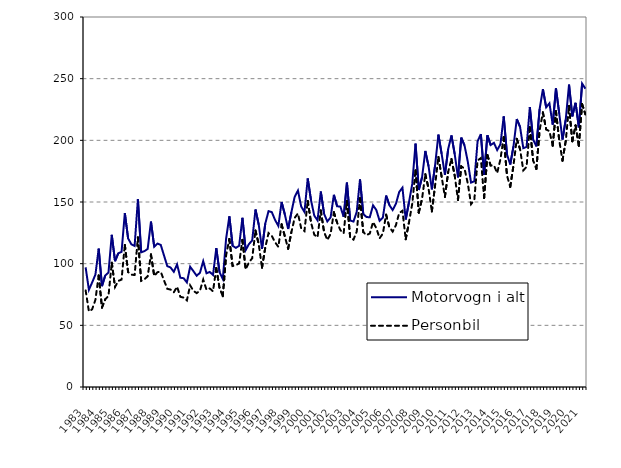
| Category | Motorvogn i alt | Personbil |
|---|---|---|
| 1983.0 | 97 | 78.3 |
| nan | 78.8 | 61.3 |
| nan | 84.8 | 63 |
| nan | 91.2 | 70.8 |
| 1984.0 | 112.2 | 90.4 |
| nan | 81.8 | 64.4 |
| nan | 90.4 | 71.1 |
| nan | 92.9 | 73.9 |
| 1985.0 | 123.4 | 100.8 |
| nan | 102 | 81.1 |
| nan | 108.4 | 86 |
| nan | 109.6 | 87.1 |
| 1986.0 | 141 | 115.2 |
| nan | 120.5 | 93.2 |
| nan | 115.7 | 91.1 |
| nan | 114.4 | 90.8 |
| 1987.0 | 152.2 | 121.3 |
| nan | 109.2 | 86.1 |
| nan | 110.1 | 87.3 |
| nan | 112 | 89.8 |
| 1988.0 | 134.1 | 107.5 |
| nan | 113.7 | 90 |
| nan | 116.3 | 93.1 |
| nan | 115.2 | 93.4 |
| 1989.0 | 106.6 | 86.4 |
| nan | 98 | 79.6 |
| nan | 96.9 | 79 |
| nan | 93.4 | 76.8 |
| 1990.0 | 99.4 | 81.3 |
| nan | 88.6 | 73.1 |
| nan | 88.2 | 72.5 |
| nan | 84.8 | 70.2 |
| 1991.0 | 97.5 | 82.4 |
| nan | 93.9 | 78 |
| nan | 90.2 | 76.1 |
| nan | 92.6 | 78.1 |
| 1992.0 | 102 | 87.1 |
| nan | 92.2 | 78.9 |
| nan | 93.3 | 79.9 |
| nan | 90.8 | 77.6 |
| 1993.0 | 112.6 | 96.5 |
| nan | 93 | 80.1 |
| nan | 87.5 | 73.6 |
| nan | 120.1 | 106.6 |
| 1994.0 | 138.4 | 120 |
| nan | 114.5 | 98.1 |
| nan | 112.8 | 98.8 |
| nan | 114.5 | 100.2 |
| 1995.0 | 137.2 | 119.3 |
| nan | 111 | 95.4 |
| nan | 115.9 | 101 |
| nan | 118.8 | 104.4 |
| 1996.0 | 143.9 | 126.9 |
| nan | 131.6 | 115.7 |
| nan | 112 | 96.7 |
| nan | 132.5 | 113.1 |
| 1997.0 | 142.6 | 124.8 |
| nan | 141.8 | 122.5 |
| nan | 135.4 | 117.3 |
| nan | 130.6 | 113.7 |
| 1998.0 | 150 | 131.9 |
| nan | 139.8 | 122 |
| nan | 128.1 | 112.1 |
| nan | 141.8 | 125.6 |
| 1999.0 | 154.2 | 137.1 |
| nan | 159.3 | 140.7 |
| nan | 146.3 | 128.7 |
| nan | 141.9 | 126.4 |
| 2000.0 | 169.1 | 150.9 |
| nan | 151.5 | 133.4 |
| nan | 139 | 123.5 |
| nan | 135.1 | 121.4 |
| 2001.0 | 158.5 | 143.1 |
| nan | 140.46 | 125.7 |
| nan | 134.24 | 119.2 |
| nan | 137.495 | 124.072 |
| 2002.0 | 155.814 | 141.724 |
| nan | 146.543 | 133.19 |
| nan | 146.231 | 127.141 |
| nan | 137.967 | 124.641 |
| 2003.0 | 165.679 | 150.811 |
| nan | 135.021 | 121.101 |
| nan | 134.111 | 119.491 |
| nan | 142.013 | 125.959 |
| 2004.0 | 168.309 | 153.043 |
| nan | 140.267 | 125.568 |
| nan | 137.77 | 123.121 |
| nan | 137.685 | 124.506 |
| 2005.0 | 147.311 | 133.756 |
| nan | 143.517 | 128.79 |
| nan | 134.783 | 120.571 |
| nan | 137.37 | 124.382 |
| 2006.0 | 155.213 | 139.728 |
| nan | 147.444 | 129.572 |
| nan | 143.451 | 126.006 |
| nan | 148.561 | 131.195 |
| 2007.0 | 158.1 | 141.084 |
| nan | 161.613 | 142.897 |
| nan | 135.821 | 119.753 |
| nan | 149.791 | 133.498 |
| 2008.0 | 164.642 | 148.614 |
| nan | 197.287 | 175.714 |
| nan | 159.718 | 141.407 |
| nan | 170.057 | 152.54 |
| 2009.0 | 191.38 | 172.559 |
| nan | 178.906 | 160.765 |
| nan | 160.234 | 142.312 |
| nan | 179.857 | 163.532 |
| 2010.0 | 204.636 | 186.507 |
| nan | 188.957 | 170.463 |
| nan | 172.077 | 154.156 |
| nan | 192.961 | 174.399 |
| 2011.0 | 204.005 | 184.86 |
| nan | 188.741 | 171.333 |
| nan | 169.934 | 151.694 |
| nan | 202.176 | 178.919 |
| 2012.0 | 195.829 | 177.072 |
| nan | 182.751 | 165.128 |
| nan | 165.73 | 148.242 |
| nan | 166.805 | 151.728 |
| 2013.0 | 199.181 | 183.653 |
| nan | 205.015 | 185.634 |
| nan | 172.044 | 153.21 |
| nan | 204.1 | 188.079 |
| 2014.0 | 196.177 | 179.552 |
| nan | 197.965 | 179.767 |
| nan | 192.105 | 173.474 |
| nan | 196.809 | 184.739 |
| 2015.0 | 219.419 | 202.592 |
| nan | 188.696 | 171.451 |
| nan | 180.388 | 162.297 |
| nan | 195.23 | 179.891 |
| 2016.0 | 217.298 | 201.197 |
| nan | 210.949 | 192.893 |
| nan | 193.648 | 175.642 |
| nan | 194.663 | 178.455 |
| 2017.0 | 227.029 | 210.738 |
| nan | 200.767 | 183.708 |
| nan | 195.059 | 176.766 |
| nan | 225.423 | 208.218 |
| 2018.0 | 241.528 | 222.678 |
| nan | 226.771 | 208.839 |
| nan | 230.044 | 207.395 |
| nan | 212.667 | 195.666 |
| 2019.0 | 242.056 | 223.584 |
| nan | 221.711 | 199.972 |
| nan | 200.668 | 183.518 |
| nan | 216.92 | 199.72 |
| 2020.0 | 245.163 | 227.947 |
| nan | 219.434 | 199.239 |
| nan | 230.409 | 212.039 |
| nan | 210.538 | 195.423 |
| 2021.0 | 246.037 | 229.482 |
| nan | 241.941 | 221.096 |